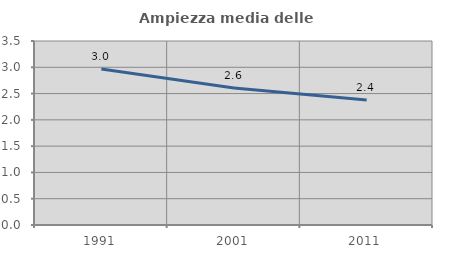
| Category | Ampiezza media delle famiglie |
|---|---|
| 1991.0 | 2.968 |
| 2001.0 | 2.608 |
| 2011.0 | 2.379 |